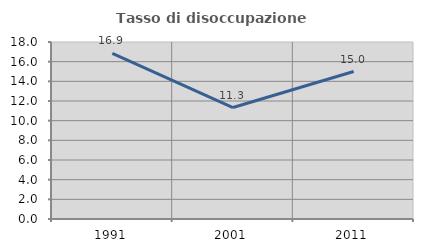
| Category | Tasso di disoccupazione giovanile  |
|---|---|
| 1991.0 | 16.854 |
| 2001.0 | 11.333 |
| 2011.0 | 15 |